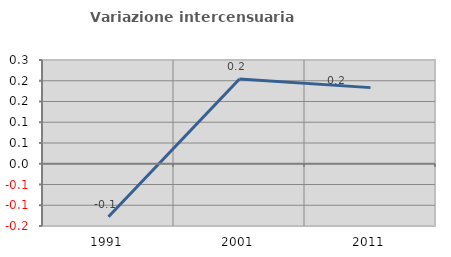
| Category | Variazione intercensuaria annua |
|---|---|
| 1991.0 | -0.128 |
| 2001.0 | 0.204 |
| 2011.0 | 0.183 |